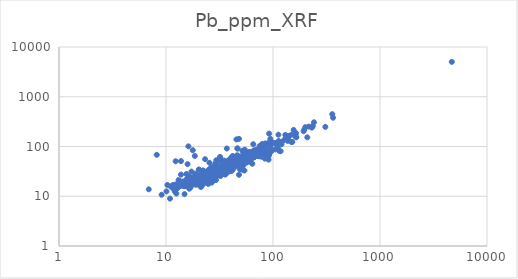
| Category | Pb_ppm_XRF |
|---|---|
| 28.1 | 22.719 |
| 19.4 | 17.628 |
| 22.0 | 26.436 |
| 19.5 | 26.174 |
| 29.3 | 26.768 |
| 21.2 | 15.335 |
| 20.8 | 23.274 |
| 40.8 | 51.527 |
| 23.9 | 30.67 |
| 16.0 | 18.832 |
| 24.0 | 21.08 |
| 26.5 | 24.616 |
| 37.2 | 36.813 |
| 89.1 | 79.754 |
| 26.8 | 31.269 |
| 58.6 | 63.279 |
| 164.4 | 184.987 |
| 4689.5 | 5025.413 |
| 41.3 | 40.464 |
| 51.2 | 49.447 |
| 29.1 | 26.64 |
| 38.2 | 41.502 |
| 63.7 | 73.451 |
| 57.3 | 67.983 |
| 58.8 | 60.437 |
| 33.3 | 31.119 |
| 42.7 | 53.228 |
| 40.1 | 40.004 |
| 30.3 | 30.621 |
| 31.0 | 27.154 |
| 32.3 | 25.457 |
| 16.0 | 19.764 |
| 24.7 | 23.636 |
| 24.9 | 21.201 |
| 58.0 | 57.03 |
| 52.7 | 42.193 |
| 56.0 | 52.61 |
| 88.0 | 68.444 |
| 59.6 | 49.797 |
| 52.6 | 53.948 |
| 25.1 | 20.364 |
| 27.7 | 20.676 |
| 22.2 | 21.537 |
| 70.2 | 75.081 |
| 56.7 | 47.71 |
| 73.5 | 63.642 |
| 66.9 | 61.399 |
| 65.6 | 70.548 |
| 58.3 | 57.573 |
| 42.8 | 39.249 |
| 19.8 | 17.197 |
| 16.9 | 19.951 |
| 16.0 | 19.993 |
| 19.1 | 18.796 |
| 27.0 | 31.567 |
| 44.7 | 54.458 |
| 60.5 | 58.595 |
| 81.0 | 82.099 |
| 24.7 | 26.571 |
| 55.2 | 64.433 |
| 18.9 | 21.975 |
| 25.0 | 22.955 |
| 20.0 | 17.707 |
| 18.7 | 21.255 |
| 13.1 | 17.602 |
| 21.9 | 24.862 |
| 46.6 | 60.312 |
| 17.4 | 21.866 |
| 24.8 | 17.676 |
| 13.1 | 16.125 |
| 28.1 | 24.296 |
| 20.5 | 23.447 |
| 46.3 | 53.278 |
| 21.5 | 26.491 |
| 33.6 | 28.641 |
| 16.8 | 21.522 |
| 32.2 | 31.441 |
| 39.5 | 40.967 |
| 48.0 | 40.398 |
| 60.6 | 54.474 |
| 42.8 | 38.52 |
| 51.9 | 40.71 |
| 149.1 | 122.869 |
| 38.7 | 35.968 |
| 32.2 | 34.239 |
| 48.8 | 53.068 |
| 28.1 | 31.004 |
| 33.3 | 27.943 |
| 32.6 | 30.156 |
| 23.8 | 19.486 |
| 58.0 | 63.95 |
| 69.0 | 76.091 |
| 55.8 | 62.026 |
| 19.8 | 25.72 |
| 30.7 | 33.884 |
| 72.0 | 64.665 |
| 308.5 | 247.938 |
| 24.3 | 23.03 |
| 19.9 | 22.364 |
| 22.1 | 24.572 |
| 18.6 | 23.634 |
| 18.5 | 17.552 |
| 15.0 | 19.589 |
| 33.2 | 35.174 |
| 32.2 | 38.213 |
| 94.5 | 143.373 |
| 28.1 | 26.156 |
| 56.1 | 72.371 |
| 27.4 | 28.72 |
| 91.4 | 64.901 |
| 49.0 | 62.52 |
| 39.3 | 38.94 |
| 19.9 | 25.703 |
| 30.0 | 29.737 |
| 55.9 | 66.019 |
| 41.0 | 39.49 |
| 48.8 | 54.16 |
| 108.5 | 109.917 |
| 48.4 | 39.577 |
| 155.9 | 215.253 |
| 16.9 | 15.11 |
| 25.5 | 47.134 |
| 17.9 | 18.455 |
| 13.3 | 15.797 |
| 11.1 | 15.573 |
| 16.3 | 19.935 |
| 13.0 | 15.017 |
| 9.1 | 10.713 |
| 19.0 | 17.054 |
| 19.5 | 22.585 |
| 22.9 | 21.051 |
| 23.7 | 23.791 |
| 24.9 | 28.727 |
| 18.8 | 20.077 |
| 25.4 | 24.546 |
| 56.3 | 62.012 |
| 18.9 | 17.94 |
| 79.2 | 92.288 |
| 69.5 | 66.903 |
| 33.2 | 34.036 |
| 38.6 | 52.955 |
| 126.5 | 134.353 |
| 80.0 | 72.244 |
| 29.5 | 47.116 |
| 22.5 | 21.893 |
| 61.8 | 52.113 |
| 44.2 | 55.368 |
| 130.4 | 171.055 |
| 137.4 | 129.673 |
| 43.7 | 42.075 |
| 49.0 | 52.834 |
| 66.5 | 60.549 |
| 35.7 | 39.756 |
| 164.1 | 154.734 |
| 35.3 | 38.123 |
| 37.8 | 46.435 |
| 31.3 | 34.826 |
| 209.3 | 152.785 |
| 27.1 | 29.989 |
| 29.5 | 35.441 |
| 24.7 | 23.988 |
| 24.2 | 25.263 |
| 17.8 | 19.563 |
| 12.1 | 12.494 |
| 16.6 | 19.424 |
| 11.5 | 16.454 |
| 235.5 | 256.738 |
| 216.5 | 251.409 |
| 230.6 | 240.181 |
| 34.7 | 48.498 |
| 35.5 | 33.614 |
| 25.8 | 28.713 |
| 29.8 | 40.888 |
| 19.2 | 21.742 |
| 149.5 | 173.175 |
| 64.4 | 59.343 |
| 23.7 | 28.29 |
| 15.5 | 27.989 |
| 36.3 | 50.37 |
| 32.9 | 37.241 |
| 37.5 | 37.262 |
| 64.0 | 64.489 |
| 100.2 | 119.126 |
| 59.3 | 65.109 |
| 44.5 | 56.393 |
| 38.1 | 42.09 |
| 59.9 | 76.428 |
| 65.2 | 70.987 |
| 117.9 | 80.406 |
| 65.9 | 83.161 |
| 37.3 | 43.427 |
| 43.6 | 52.724 |
| 52.5 | 55.383 |
| 38.8 | 50.271 |
| 78.1 | 85.717 |
| 52.5 | 65.989 |
| 65.4 | 111.106 |
| 105.9 | 116.895 |
| 73.0 | 72.014 |
| 165.3 | 153.644 |
| 114.7 | 115.336 |
| 78.8 | 75.227 |
| 63.9 | 75.575 |
| 40.2 | 36.352 |
| 58.7 | 60.158 |
| 36.3 | 40.549 |
| 45.4 | 60.387 |
| 40.0 | 48.44 |
| 111.7 | 100.398 |
| 196.1 | 218.318 |
| 200.4 | 244.772 |
| 95.3 | 77.933 |
| 45.5 | 138.884 |
| 15.7 | 19.208 |
| 19.0 | 20.531 |
| 15.9 | 17.487 |
| 21.0 | 24.008 |
| 17.3 | 22.239 |
| 19.5 | 21.89 |
| 16.1 | 16.518 |
| 17.6 | 21.995 |
| 32.0 | 31.232 |
| 21.5 | 20.831 |
| 22.8 | 22.921 |
| 27.9 | 27.829 |
| 136.7 | 138.919 |
| 25.6 | 31.083 |
| 16.0 | 16.284 |
| 20.1 | 25.405 |
| 17.7 | 21.961 |
| 18.4 | 17.892 |
| 22.2 | 23.312 |
| 40.8 | 45.823 |
| 37.5 | 41.01 |
| 28.7 | 28.742 |
| 34.9 | 27.85 |
| 54.1 | 32.886 |
| 35.0 | 47.068 |
| 27.4 | 38.835 |
| 37.2 | 37.721 |
| 77.1 | 81.426 |
| 45.0 | 45.077 |
| 69.9 | 72.414 |
| 41.0 | 42.055 |
| 43.1 | 46.862 |
| 81.4 | 67.499 |
| 48.9 | 49.77 |
| 52.4 | 58.682 |
| 53.9 | 64.98 |
| 52.6 | 58.346 |
| 48.9 | 51.21 |
| 77.9 | 93.91 |
| 79.9 | 111.371 |
| 84.7 | 110.276 |
| 91.3 | 74.479 |
| 79.2 | 72.265 |
| 69.8 | 85.8 |
| 46.0 | 50.435 |
| 90.6 | 118.66 |
| 84.7 | 115.253 |
| 84.1 | 91.117 |
| 107.2 | 110.511 |
| 114.8 | 81.179 |
| 33.2 | 50.72 |
| 22.3 | 29.699 |
| 49.1 | 57.038 |
| 32.6 | 37.758 |
| 23.9 | 30.652 |
| 38.9 | 32.455 |
| 28.8 | 34.592 |
| 22.2 | 32.946 |
| 25.9 | 27.705 |
| 17.0 | 22.448 |
| 27.9 | 26.707 |
| 30.1 | 26.649 |
| 40.1 | 34.414 |
| 19.7 | 21.002 |
| 21.6 | 24.793 |
| 21.7 | 27.536 |
| 16.3 | 17.72 |
| 78.0 | 62.339 |
| 60.0 | 72.761 |
| 34.4 | 34.37 |
| 27.1 | 27.5 |
| 23.6 | 26.427 |
| 120.2 | 110.981 |
| 32.8 | 34.521 |
| 15.1 | 19.176 |
| 20.6 | 18.364 |
| 21.5 | 26.728 |
| 18.6 | 22.706 |
| 35.0 | 39.92 |
| 32.0 | 35.595 |
| 34.8 | 52.148 |
| 92.0 | 181.645 |
| 28.1 | 30.638 |
| 32.9 | 41.976 |
| 38.3 | 45.938 |
| 36.2 | 35.544 |
| 53.8 | 50.999 |
| 63.2 | 63.657 |
| 46.8 | 46.346 |
| 40.3 | 52.038 |
| 43.5 | 51.643 |
| 81.6 | 93.331 |
| 99.2 | 85.121 |
| 39.5 | 51.727 |
| 151.4 | 123.744 |
| 95.6 | 109.056 |
| 95.7 | 124.586 |
| 358.1 | 446.314 |
| 105.6 | 87.542 |
| 31.6 | 30.525 |
| 48.1 | 142.489 |
| 32.0 | 56.53 |
| 69.2 | 74.091 |
| 59.9 | 62.229 |
| 112.2 | 118.82 |
| 241.6 | 306.541 |
| 193.3 | 202.801 |
| 29.6 | 38.989 |
| 22.4 | 31.717 |
| 45.2 | 50.144 |
| 38.3 | 49.31 |
| 23.5 | 23.036 |
| 20.3 | 34.013 |
| 26.9 | 28.754 |
| 27.4 | 28.348 |
| 19.4 | 21.486 |
| 39.4 | 50.66 |
| 27.1 | 28.613 |
| 41.5 | 34.518 |
| 19.5 | 19.709 |
| 31.4 | 32.42 |
| 28.3 | 21.485 |
| 21.1 | 20.701 |
| 30.9 | 28.924 |
| 28.2 | 33.248 |
| 23.0 | 29.223 |
| 13.8 | 27.242 |
| 54.5 | 86.226 |
| 22.1 | 25.943 |
| 17.3 | 23.061 |
| 26.2 | 27.644 |
| 33.3 | 33.457 |
| 40.5 | 51.771 |
| 107.5 | 117.042 |
| 132.6 | 151.713 |
| 81.7 | 107.74 |
| 77.1 | 101.294 |
| 64.1 | 44.937 |
| 39.4 | 50.946 |
| 26.6 | 34.73 |
| 30.1 | 36.927 |
| 56.5 | 75.864 |
| 42.1 | 64.181 |
| 53.3 | 62.477 |
| 45.1 | 53.428 |
| 37.0 | 91.153 |
| 18.6 | 64.636 |
| 17.8 | 84.244 |
| 15.9 | 44.164 |
| 41.2 | 49.741 |
| 24.5 | 28.272 |
| 20.6 | 21.307 |
| 10.3 | 16.872 |
| 23.5 | 26.508 |
| 14.1 | 17.831 |
| 26.4 | 31.788 |
| 92.1 | 70.108 |
| 25.1 | 23.024 |
| 28.2 | 32.837 |
| 24.3 | 22.125 |
| 27.4 | 22.452 |
| 24.3 | 29.021 |
| 55.4 | 51.109 |
| 28.2 | 30.291 |
| 137.8 | 143.965 |
| 42.7 | 35.79 |
| 34.2 | 32.897 |
| 10.9 | 8.958 |
| 49.2 | 34.618 |
| 47.3 | 56.328 |
| 69.0 | 84.742 |
| 28.2 | 36.366 |
| 141.4 | 164.024 |
| 40.4 | 39.161 |
| 14.8 | 15.863 |
| 36.1 | 41.432 |
| 21.3 | 27.234 |
| 21.7 | 24.595 |
| 18.3 | 19.587 |
| 17.5 | 19.758 |
| 49.4 | 39.093 |
| 16.0 | 20.012 |
| 35.1 | 28.85 |
| 16.5 | 25.2 |
| 21.4 | 24.721 |
| 23.8 | 25.311 |
| 32.3 | 35.117 |
| 29.6 | 28.528 |
| 22.1 | 27.866 |
| 21.9 | 21.63 |
| 41.5 | 47.162 |
| 113.1 | 129.077 |
| 73.8 | 82.025 |
| 51.4 | 59.883 |
| 57.9 | 70.086 |
| 54.9 | 47.327 |
| 37.3 | 41.263 |
| 18.6 | 25.709 |
| 79.1 | 109.647 |
| 33.4 | 40.359 |
| 67.9 | 69.509 |
| 16.9 | 15.013 |
| 46.6 | 91.106 |
| 19.2 | 21.205 |
| 15.9 | 20.502 |
| 53.2 | 56.986 |
| 112.3 | 172.482 |
| 17.2 | 21.656 |
| 35.8 | 32.712 |
| 26.4 | 37.524 |
| 25.9 | 30.452 |
| 23.5 | 31.114 |
| 77.4 | 87.888 |
| 26.9 | 26.068 |
| 27.7 | 29.359 |
| 21.8 | 24.992 |
| 26.2 | 30.758 |
| 29.4 | 31.189 |
| 29.0 | 23.384 |
| 28.2 | 32.553 |
| 28.3 | 31.647 |
| 36.4 | 42.345 |
| 39.4 | 46.448 |
| 60.1 | 54.782 |
| 16.2 | 100.718 |
| 38.6 | 50.42 |
| 22.6 | 22.975 |
| 29.6 | 41.314 |
| 21.1 | 24.442 |
| 19.7 | 20.26 |
| 19.1 | 23.18 |
| 39.6 | 43.891 |
| 28.9 | 45.112 |
| 14.3 | 19.854 |
| 44.5 | 40.167 |
| 24.2 | 30.188 |
| 23.2 | 24.289 |
| 15.3 | 16.591 |
| 25.0 | 26.525 |
| 31.2 | 31.229 |
| 17.6 | 22.801 |
| 15.6 | 22.137 |
| 13.0 | 17.616 |
| 56.0 | 52.799 |
| 35.6 | 45.234 |
| 35.3 | 37.597 |
| 29.7 | 34.433 |
| 48.7 | 62.182 |
| 20.3 | 34.427 |
| 26.1 | 29.098 |
| 24.5 | 26.648 |
| 25.4 | 24.92 |
| 51.8 | 34.137 |
| 21.9 | 21.791 |
| 35.8 | 27.267 |
| 40.0 | 45.366 |
| 40.0 | 32.014 |
| 21.4 | 24.393 |
| 18.8 | 28.428 |
| 23.8 | 22.633 |
| 24.2 | 18.527 |
| 29.3 | 21.187 |
| 84.0 | 57.095 |
| 27.2 | 30.219 |
| 46.3 | 66.75 |
| 55.4 | 54.324 |
| 19.6 | 18.19 |
| 74.9 | 101.638 |
| 86.1 | 88.744 |
| 23.1 | 18.762 |
| 19.3 | 20.591 |
| 25.2 | 34.495 |
| 41.8 | 63.536 |
| 39.3 | 51.149 |
| 88.7 | 82.255 |
| 40.3 | 58.206 |
| 29.5 | 52.852 |
| 54.9 | 68.255 |
| 40.0 | 54.178 |
| 54.4 | 72.893 |
| 71.3 | 84.471 |
| 59.5 | 73.25 |
| 48.4 | 53.296 |
| 60.7 | 66.272 |
| 53.9 | 61.268 |
| 47.5 | 56.13 |
| 38.7 | 52.287 |
| 76.5 | 79.984 |
| 21.7 | 16.316 |
| 364.3 | 378.482 |
| 74.4 | 65.806 |
| 31.2 | 29.495 |
| 33.5 | 34.456 |
| 38.6 | 35.524 |
| 48.7 | 44.791 |
| 53.3 | 76.137 |
| 31.7 | 53.704 |
| 140.2 | 159.524 |
| 112.5 | 118.842 |
| 42.2 | 60.994 |
| 32.5 | 34.894 |
| 85.7 | 74.777 |
| 56.3 | 48.511 |
| 32.0 | 61.858 |
| 36.7 | 28.836 |
| 17.7 | 20.326 |
| 60.7 | 77.824 |
| 46.5 | 91.453 |
| 51.7 | 55.972 |
| 51.7 | 82.107 |
| 48.9 | 57.727 |
| 78.0 | 79.152 |
| 94.1 | 101.399 |
| 78.4 | 109.559 |
| 35.1 | 36.198 |
| 24.2 | 21.788 |
| 25.9 | 20.764 |
| 14.9 | 11.047 |
| 37.4 | 37.428 |
| 16.7 | 17.874 |
| 26.7 | 18.779 |
| 38.5 | 31.519 |
| 26.5 | 25.794 |
| 50.1 | 41.908 |
| 76.7 | 65.922 |
| 25.9 | 22.847 |
| 18.5 | 18.232 |
| 12.6 | 14.128 |
| 10.1 | 12.532 |
| 11.8 | 13.916 |
| 16.0 | 21.226 |
| 23.2 | 55.686 |
| 34.2 | 34.754 |
| 51.3 | 64.262 |
| 27.0 | 30.411 |
| 28.3 | 31.823 |
| 43.3 | 58.841 |
| 30.4 | 34.948 |
| 23.2 | 23.646 |
| 37.1 | 31.302 |
| 31.7 | 27.688 |
| 21.4 | 20.771 |
| 16.5 | 15.352 |
| 15.2 | 15.993 |
| 38.3 | 40.321 |
| 16.3 | 19.757 |
| 14.2 | 16.207 |
| 12.3 | 17.244 |
| 15.9 | 17.215 |
| 13.1 | 21.179 |
| 39.1 | 48.195 |
| 23.8 | 20.721 |
| 23.4 | 27.125 |
| 40.2 | 52.344 |
| 20.0 | 22.861 |
| 28.7 | 30.714 |
| 26.5 | 24.978 |
| 21.2 | 26.475 |
| 77.0 | 81.743 |
| 11.7 | 16.875 |
| 41.2 | 32.309 |
| 6.9 | 13.795 |
| 55.0 | 54.109 |
| 16.5 | 14.151 |
| 19.9 | 20.874 |
| 18.9 | 17.904 |
| 12.5 | 11.32 |
| 17.3 | 31.31 |
| 8.2 | 68.028 |
| 55.4 | 52.672 |
| 90.9 | 54.386 |
| 13.8 | 50.898 |
| 16.6 | 24.564 |
| 12.3 | 50.542 |
| 25.5 | 26.436 |
| 25.1 | 27.094 |
| 48.1 | 27.003 |